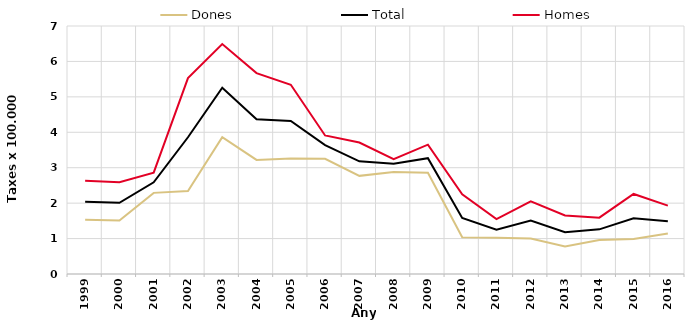
| Category | Dones | Total | Homes |
|---|---|---|---|
| 1999.0 | 1.53 | 2.04 | 2.63 |
| 2000.0 | 1.51 | 2.01 | 2.59 |
| 2001.0 | 2.29 | 2.59 | 2.86 |
| 2002.0 | 2.34 | 3.86 | 5.53 |
| 2003.0 | 3.86 | 5.26 | 6.49 |
| 2004.0 | 3.22 | 4.37 | 5.67 |
| 2005.0 | 3.26 | 4.32 | 5.34 |
| 2006.0 | 3.25 | 3.64 | 3.91 |
| 2007.0 | 2.77 | 3.18 | 3.71 |
| 2008.0 | 2.88 | 3.11 | 3.24 |
| 2009.0 | 2.86 | 3.27 | 3.65 |
| 2010.0 | 1.04 | 1.58 | 2.25 |
| 2011.0 | 1.02 | 1.25 | 1.55 |
| 2012.0 | 1 | 1.51 | 2.05 |
| 2013.0 | 0.78 | 1.18 | 1.65 |
| 2014.0 | 0.96 | 1.26 | 1.59 |
| 2015.0 | 0.99 | 1.57 | 2.26 |
| 2016.0 | 1.14 | 1.49 | 1.93 |